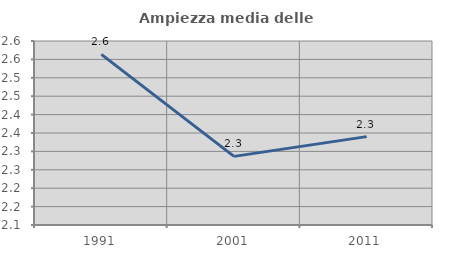
| Category | Ampiezza media delle famiglie |
|---|---|
| 1991.0 | 2.563 |
| 2001.0 | 2.286 |
| 2011.0 | 2.34 |